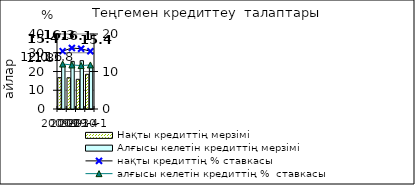
| Category | Нақты кредиттің мерзімі  | Алғысы келетін кредиттің мерзімі  |
|---|---|---|
| 2009-2 | 16.73 | 23.45 |
| 2009-3 | 16.66 | 25.4 |
| 2009-4 | 15.84 | 25.78 |
| 2010-1 | 18.51 | 23.02 |